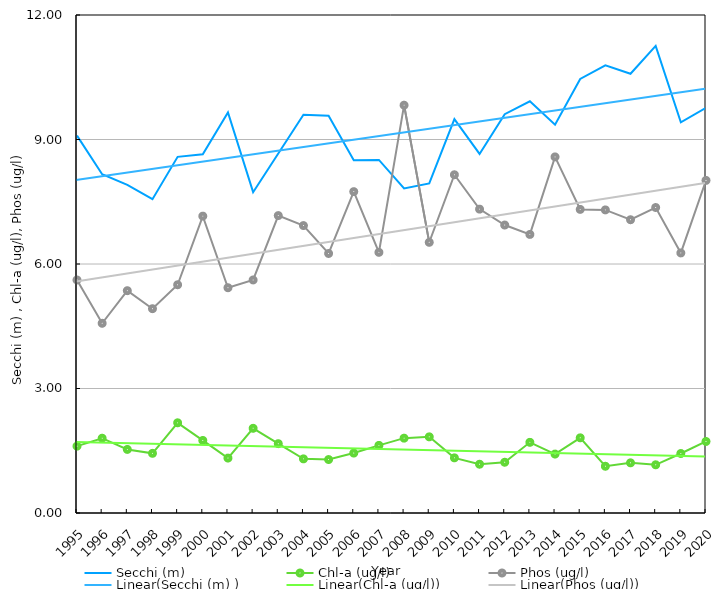
| Category | Secchi (m)  | Chl-a (ug/l) | Phos (ug/l) |
|---|---|---|---|
| 1995 | 9.092 | 1.611 | 5.615 |
| 1996 | 8.164 | 1.802 | 4.571 |
| 1997 | 7.907 | 1.532 | 5.357 |
| 1998 | 7.562 | 1.438 | 4.923 |
| 1999 | 8.582 | 2.173 | 5.5 |
| 2000 | 8.646 | 1.748 | 7.154 |
| 2001 | 9.654 | 1.324 | 5.429 |
| 2002 | 7.731 | 2.041 | 5.615 |
| 2003 | 8.661 | 1.67 | 7.167 |
| 2004 | 9.596 | 1.305 | 6.926 |
| 2005 | 9.571 | 1.288 | 6.254 |
| 2006 | 8.5 | 1.444 | 7.744 |
| 2007 | 8.508 | 1.63 | 6.281 |
| 2008 | 7.819 | 1.803 | 9.827 |
| 2009 | 7.942 | 1.835 | 6.522 |
| 2010 | 9.493 | 1.329 | 8.151 |
| 2011 | 8.652 | 1.175 | 7.322 |
| 2012 | 9.611 | 1.223 | 6.939 |
| 2013 | 9.921 | 1.703 | 6.713 |
| 2014 | 9.359 | 1.42 | 8.581 |
| 2015 | 10.459 | 1.812 | 7.316 |
| 2016 | 10.786 | 1.126 | 7.304 |
| 2017 | 10.583 | 1.209 | 7.067 |
| 2018 | 11.257 | 1.161 | 7.361 |
| 2019 | 9.414 | 1.434 | 6.267 |
| 2020 | 9.764 | 1.724 | 8.014 |